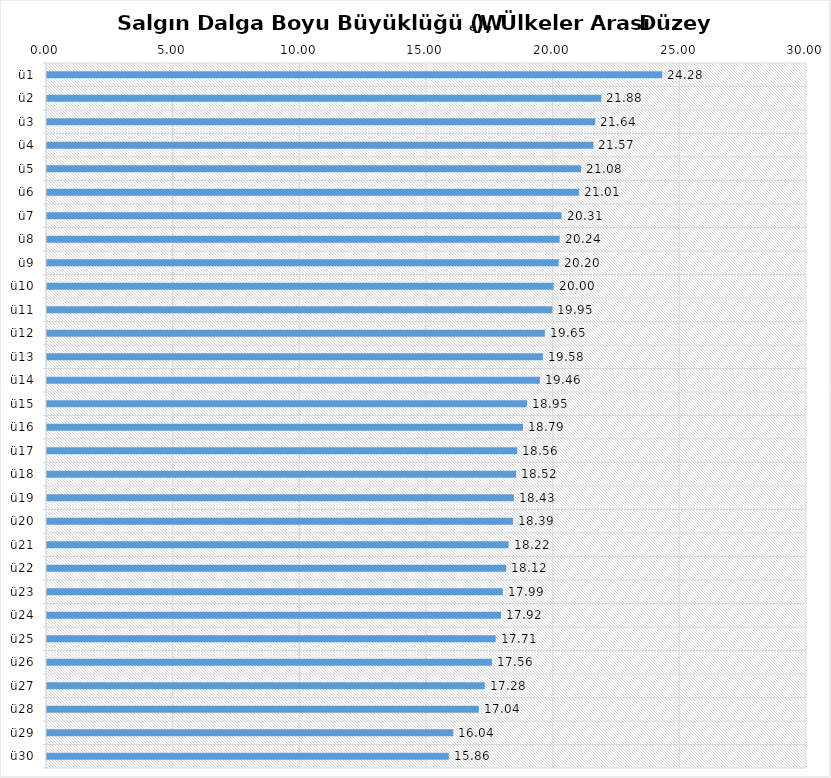
| Category | ü30 |
|---|---|
| ü1 | 24.284 |
| ü2 | 21.881 |
| ü3 | 21.641 |
| ü4 | 21.569 |
| ü5 | 21.078 |
| ü6 | 21.006 |
| ü7 | 20.311 |
| ü8 | 20.236 |
| ü9 | 20.198 |
| ü10 | 19.999 |
| ü11 | 19.95 |
| ü12 | 19.652 |
| ü13 | 19.576 |
| ü14 | 19.457 |
| ü15 | 18.947 |
| ü16 | 18.786 |
| ü17 | 18.561 |
| ü18 | 18.518 |
| ü19 | 18.429 |
| ü20 | 18.392 |
| ü21 | 18.22 |
| ü22 | 18.122 |
| ü23 | 17.992 |
| ü24 | 17.924 |
| ü25 | 17.711 |
| ü26 | 17.562 |
| ü27 | 17.279 |
| ü28 | 17.044 |
| ü29 | 16.04 |
| ü30 | 15.861 |